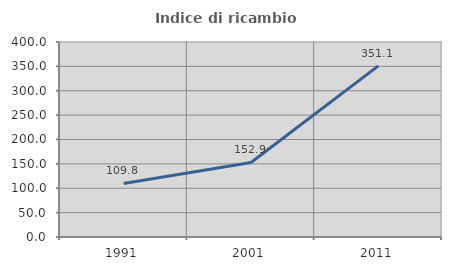
| Category | Indice di ricambio occupazionale  |
|---|---|
| 1991.0 | 109.816 |
| 2001.0 | 152.857 |
| 2011.0 | 351.087 |